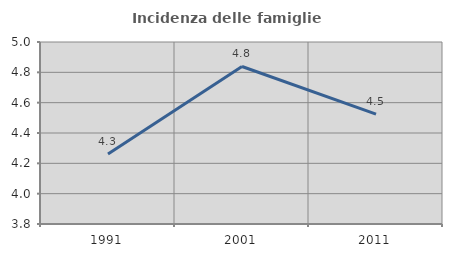
| Category | Incidenza delle famiglie numerose |
|---|---|
| 1991.0 | 4.262 |
| 2001.0 | 4.839 |
| 2011.0 | 4.525 |